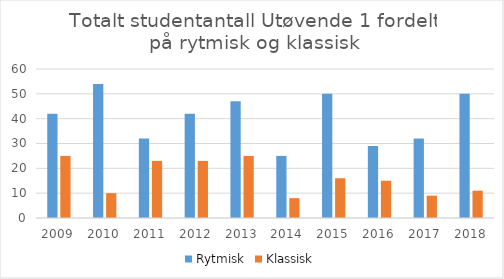
| Category | Rytmisk | Klassisk |
|---|---|---|
| 2009.0 | 42 | 25 |
| 2010.0 | 54 | 10 |
| 2011.0 | 32 | 23 |
| 2012.0 | 42 | 23 |
| 2013.0 | 47 | 25 |
| 2014.0 | 25 | 8 |
| 2015.0 | 50 | 16 |
| 2016.0 | 29 | 15 |
| 2017.0 | 32 | 9 |
| 2018.0 | 50 | 11 |